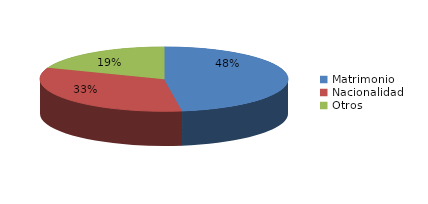
| Category | Series 0 |
|---|---|
| Matrimonio | 2094 |
| Nacionalidad | 1453 |
| Otros | 845 |